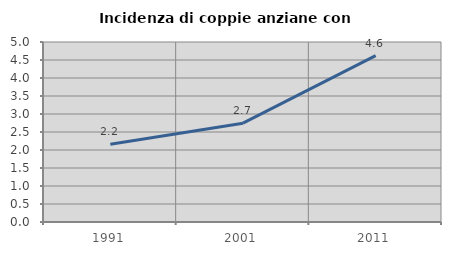
| Category | Incidenza di coppie anziane con figli |
|---|---|
| 1991.0 | 2.158 |
| 2001.0 | 2.746 |
| 2011.0 | 4.624 |